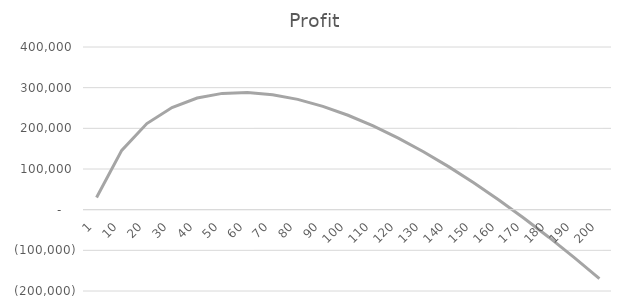
| Category | Series 2 |
|---|---|
| 1.0 | 30000 |
| 10.0 | 145746.176 |
| 20.0 | 211701.674 |
| 30.0 | 251291.479 |
| 40.0 | 274508.677 |
| 50.0 | 285912.517 |
| 60.0 | 288115.558 |
| 70.0 | 282807.888 |
| 80.0 | 271170.073 |
| 90.0 | 254071.942 |
| 100.0 | 232180.084 |
| 110.0 | 206021.03 |
| 120.0 | 176020.796 |
| 130.0 | 142530.877 |
| 140.0 | 105846.025 |
| 150.0 | 66216.818 |
| 160.0 | 23858.788 |
| 170.0 | -21040.794 |
| 180.0 | -68317.76 |
| 190.0 | -117827.077 |
| 200.0 | -169439.72 |